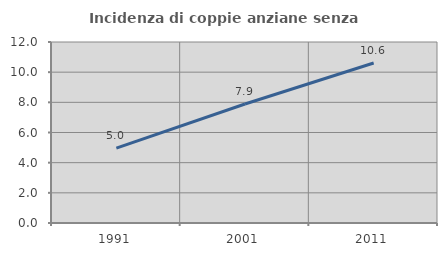
| Category | Incidenza di coppie anziane senza figli  |
|---|---|
| 1991.0 | 4.966 |
| 2001.0 | 7.89 |
| 2011.0 | 10.606 |